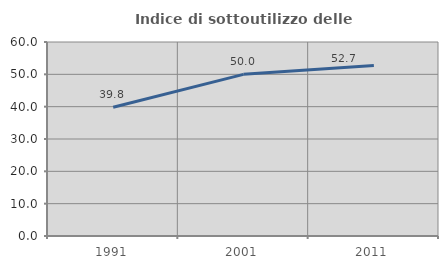
| Category | Indice di sottoutilizzo delle abitazioni  |
|---|---|
| 1991.0 | 39.828 |
| 2001.0 | 50 |
| 2011.0 | 52.736 |